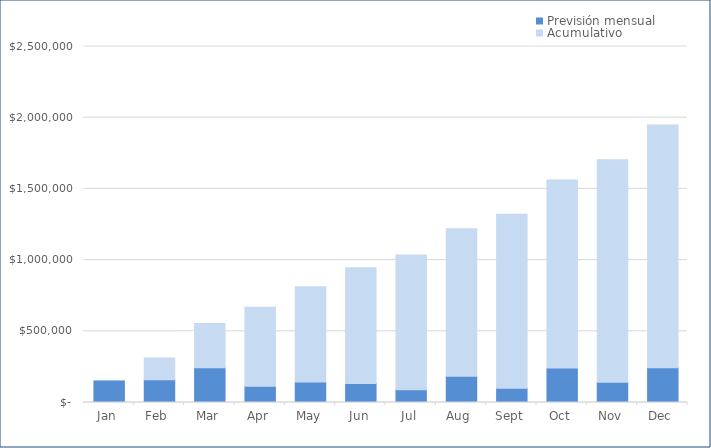
| Category | Previsión mensual | Acumulativo |
|---|---|---|
| 2020-01-01 | 151600 | 0 |
| 2020-02-01 | 160320 | 151600 |
| 2020-03-01 | 243500 | 311920 |
| 2020-04-01 | 113450 | 555420 |
| 2020-05-01 | 143200 | 668870 |
| 2020-06-01 | 134000 | 812070 |
| 2020-07-01 | 89400 | 946070 |
| 2020-08-01 | 184900 | 1035470 |
| 2020-09-01 | 100800 | 1220370 |
| 2020-10-01 | 241850 | 1321170 |
| 2020-11-01 | 142425 | 1563020 |
| 2020-12-01 | 243400 | 1705445 |